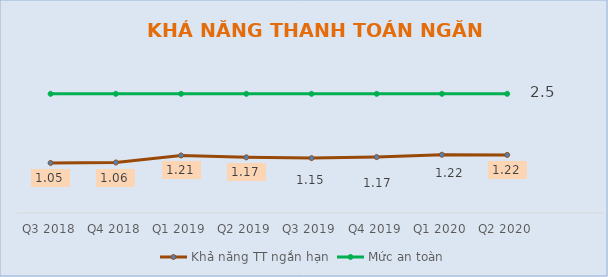
| Category | Khả năng TT ngắn hạn | Mức an toàn |
|---|---|---|
| Q3 2018 | 1.05 | 2.5 |
| Q4 2018 | 1.059 | 2.5 |
| Q1 2019 | 1.207 | 2.5 |
| Q2 2019 | 1.167 | 2.5 |
| Q3 2019 | 1.152 | 2.5 |
| Q4 2019 | 1.172 | 2.5 |
| Q1 2020 | 1.222 | 2.5 |
| Q2 2020 | 1.218 | 2.5 |